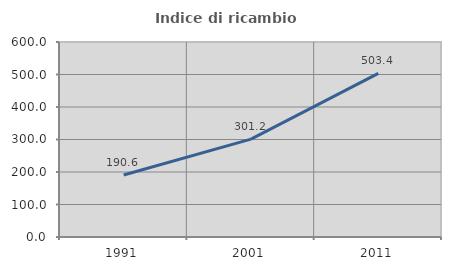
| Category | Indice di ricambio occupazionale  |
|---|---|
| 1991.0 | 190.638 |
| 2001.0 | 301.165 |
| 2011.0 | 503.368 |